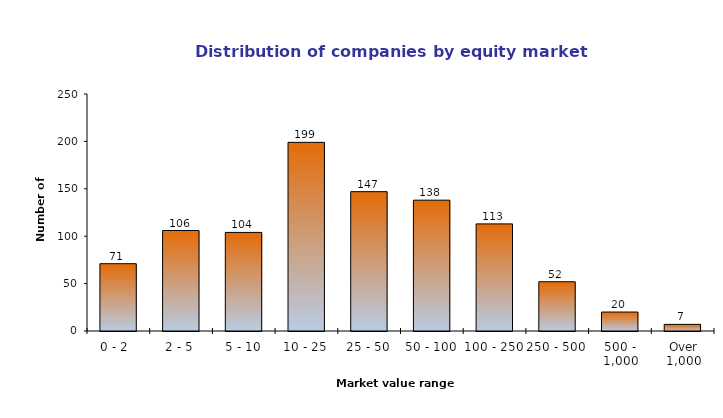
| Category | AIM |
|---|---|
| Over 1,000 | 7 |
| 500 - 1,000 | 20 |
| 250 - 500 | 52 |
| 100 - 250 | 113 |
| 50 - 100 | 138 |
| 25 - 50 | 147 |
| 10 - 25 | 199 |
| 5 - 10 | 104 |
| 2 - 5 | 106 |
| 0 - 2  | 71 |